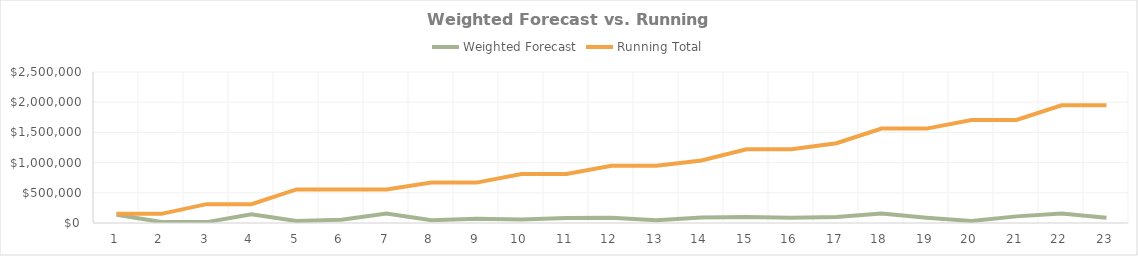
| Category | Weighted Forecast | Running Total |
|---|---|---|
| 0 | 135000 | 151600 |
| 1 | 16600 | 151600 |
| 2 | 14520 | 311920 |
| 3 | 145800 | 311920 |
| 4 | 32500 | 555420 |
| 5 | 54000 | 555420 |
| 6 | 157000 | 555420 |
| 7 | 44250 | 668870 |
| 8 | 69200 | 668870 |
| 9 | 59200 | 812070 |
| 10 | 84000 | 812070 |
| 11 | 87500 | 946070 |
| 12 | 46500 | 946070 |
| 13 | 89400 | 1035470 |
| 14 | 99400 | 1220370 |
| 15 | 85500 | 1220370 |
| 16 | 100800 | 1321170 |
| 17 | 155250 | 1563020 |
| 18 | 86600 | 1563020 |
| 19 | 32700 | 1705445 |
| 20 | 109725 | 1705445 |
| 21 | 155500 | 1948845 |
| 22 | 87900 | 1948845 |